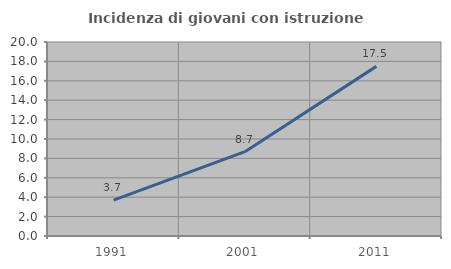
| Category | Incidenza di giovani con istruzione universitaria |
|---|---|
| 1991.0 | 3.704 |
| 2001.0 | 8.696 |
| 2011.0 | 17.486 |